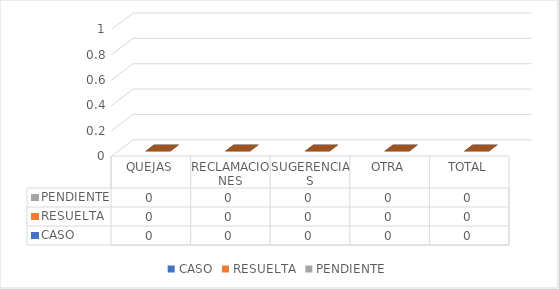
| Category | CASO | RESUELTA | PENDIENTE |
|---|---|---|---|
| QUEJAS | 0 | 0 | 0 |
| RECLAMACIONES | 0 | 0 | 0 |
| SUGERENCIAS | 0 | 0 | 0 |
| OTRA | 0 | 0 | 0 |
| TOTAL | 0 | 0 | 0 |